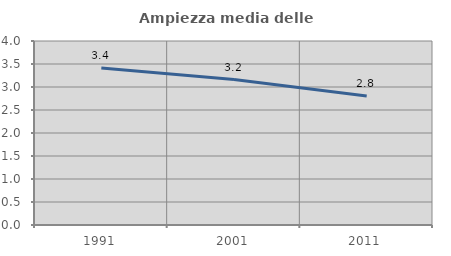
| Category | Ampiezza media delle famiglie |
|---|---|
| 1991.0 | 3.412 |
| 2001.0 | 3.162 |
| 2011.0 | 2.805 |